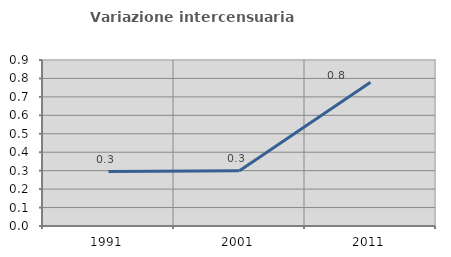
| Category | Variazione intercensuaria annua |
|---|---|
| 1991.0 | 0.295 |
| 2001.0 | 0.299 |
| 2011.0 | 0.779 |